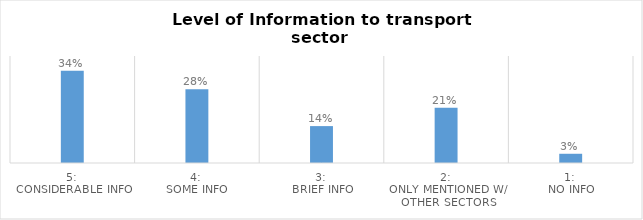
| Category | Series 0 |
|---|---|
| 5: 
Considerable info | 0.345 |
| 4: 
Some info | 0.276 |
| 3: 
Brief info | 0.138 |
| 2: 
Only mentioned w/ other sectors | 0.207 |
| 1: 
No info | 0.034 |